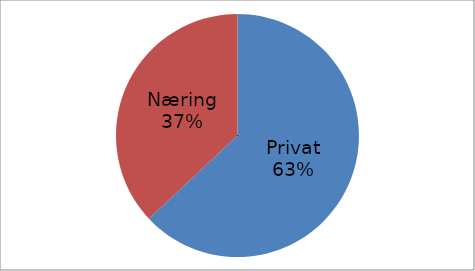
| Category | Series 0 |
|---|---|
| Privat | 44290944 |
| Næring | 26017534 |